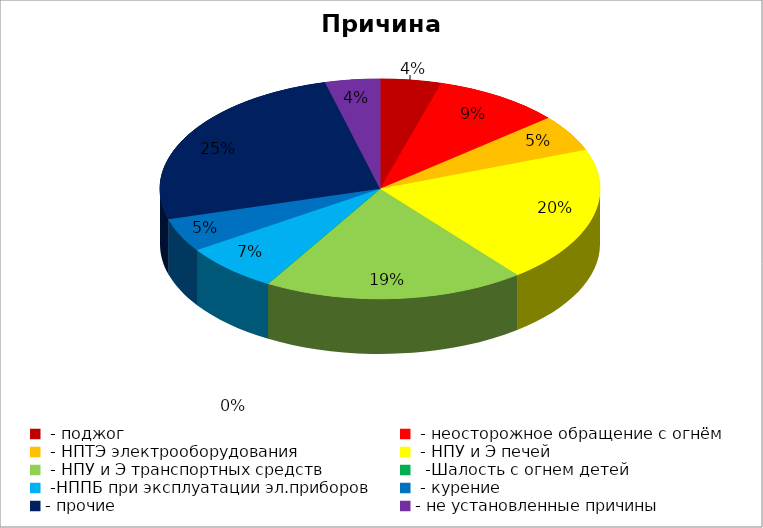
| Category | Причина пожара |
|---|---|
|  - поджог | 10 |
|  - неосторожное обращение с огнём | 21 |
|  - НПТЭ электрооборудования | 12 |
|  - НПУ и Э печей | 45 |
|  - НПУ и Э транспортных средств | 43 |
|   -Шалость с огнем детей | 0 |
|  -НППБ при эксплуатации эл.приборов | 16 |
|  - курение | 11 |
| - прочие | 57 |
| - не установленные причины | 9 |